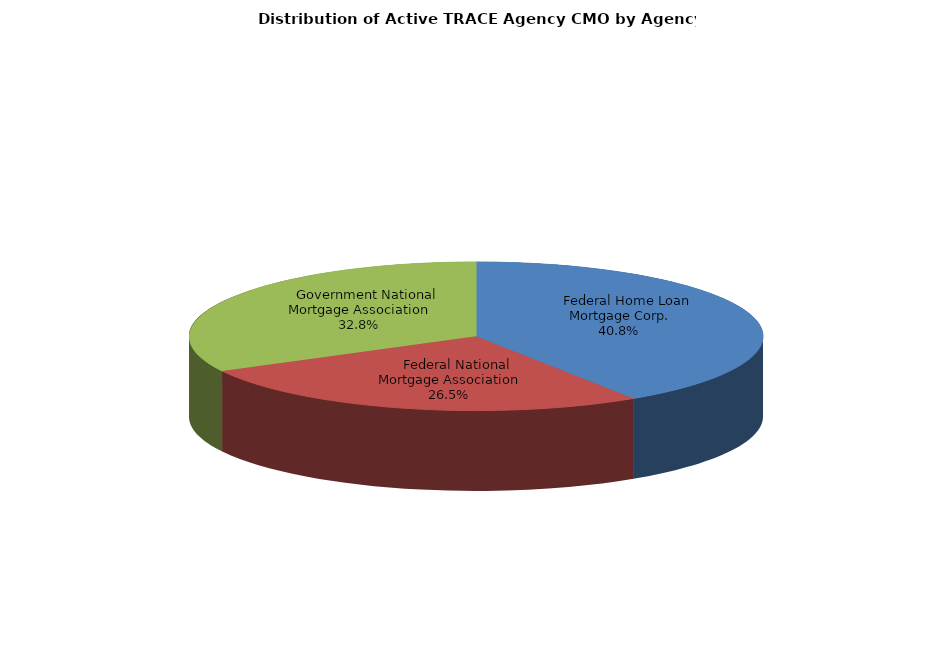
| Category | Series 0 |
|---|---|
|     Federal Home Loan Mortgage Corp. | 103327 |
|     Federal National Mortgage Association | 67156 |
|     Government National Mortgage Association | 83049 |